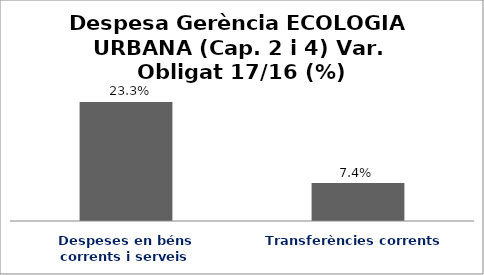
| Category | Series 0 |
|---|---|
| Despeses en béns corrents i serveis | 0.233 |
| Transferències corrents | 0.074 |